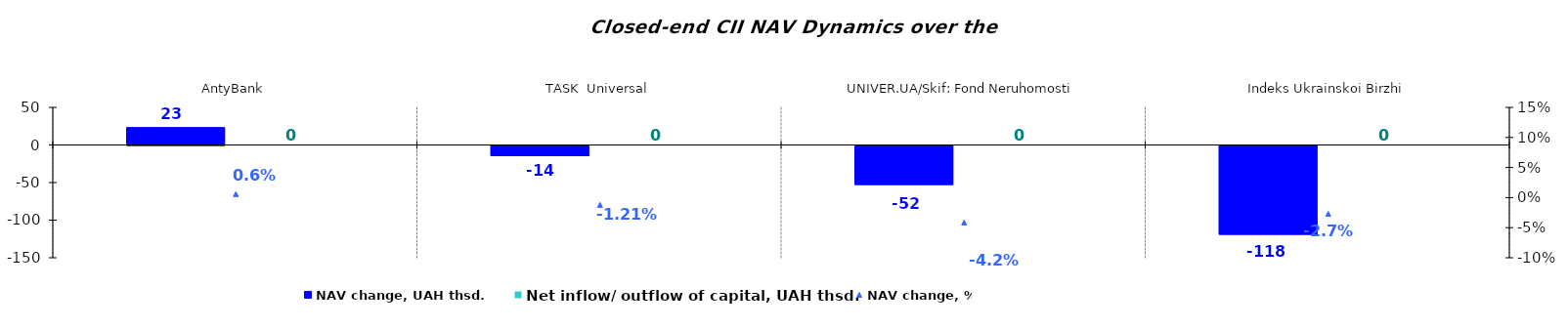
| Category | NAV change, UAH thsd. | Net inflow/ outflow of capital, UAH thsd. |
|---|---|---|
| AntyBank | 23.201 | 0 |
| TASK  Universal | -13.522 | 0 |
| UNIVER.UA/Skif: Fond Neruhomosti | -51.995 | 0 |
| Indeks Ukrainskoi Birzhi | -118.178 | 0 |